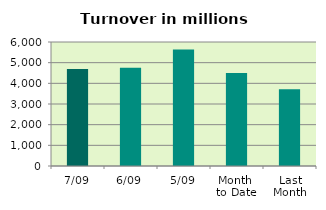
| Category | Series 0 |
|---|---|
| 7/09 | 4698.388 |
| 6/09 | 4749.156 |
| 5/09 | 5633.508 |
| Month 
to Date | 4497.975 |
| Last
Month | 3714.081 |